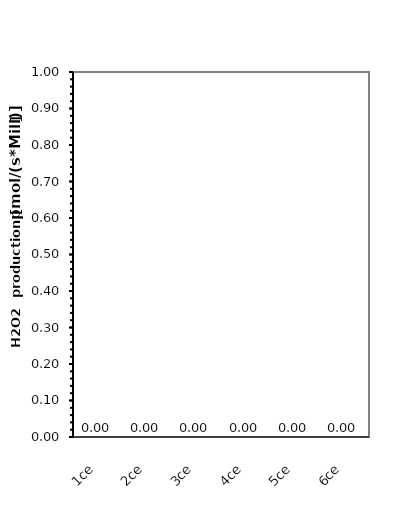
| Category | Amount per chamber (Mill cells/chamber) |
|---|---|
| 1ce | 0 |
| 2ce | 0 |
| 3ce | 0 |
| 4ce | 0 |
| 5ce | 0 |
| 6ce | 0 |